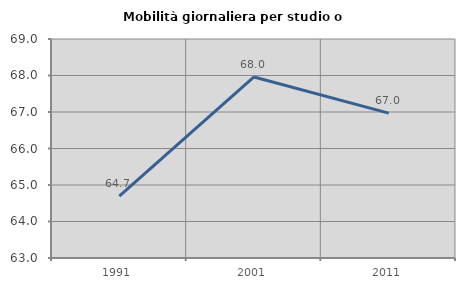
| Category | Mobilità giornaliera per studio o lavoro |
|---|---|
| 1991.0 | 64.693 |
| 2001.0 | 67.959 |
| 2011.0 | 66.97 |